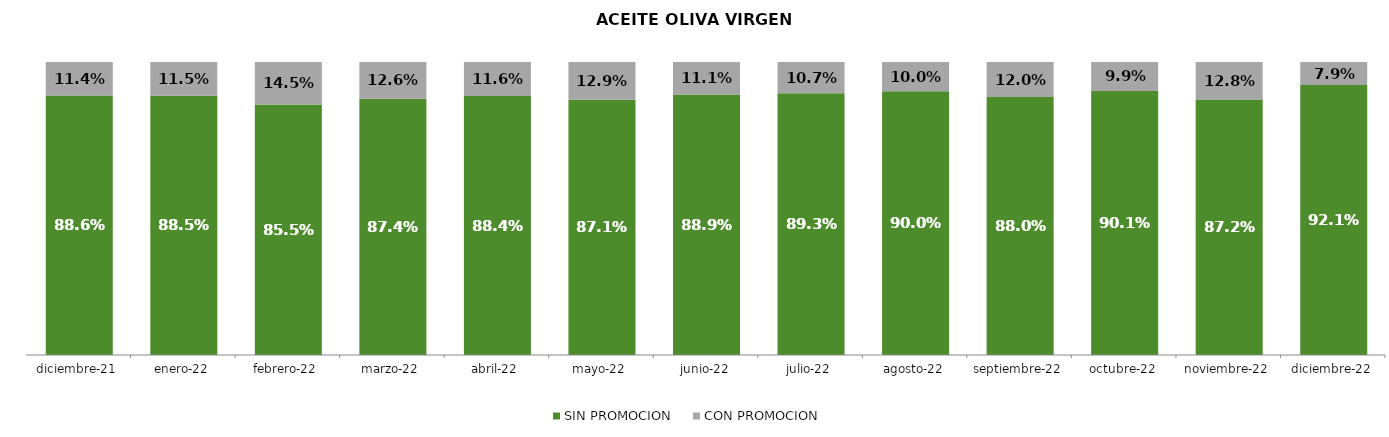
| Category | SIN PROMOCION   | CON PROMOCION   |
|---|---|---|
| 2021-12-01 | 0.886 | 0.114 |
| 2022-01-01 | 0.885 | 0.115 |
| 2022-02-01 | 0.855 | 0.145 |
| 2022-03-01 | 0.874 | 0.126 |
| 2022-04-01 | 0.884 | 0.116 |
| 2022-05-01 | 0.871 | 0.129 |
| 2022-06-01 | 0.889 | 0.111 |
| 2022-07-01 | 0.893 | 0.107 |
| 2022-08-01 | 0.9 | 0.1 |
| 2022-09-01 | 0.88 | 0.12 |
| 2022-10-01 | 0.901 | 0.099 |
| 2022-11-01 | 0.872 | 0.128 |
| 2022-12-01 | 0.921 | 0.079 |